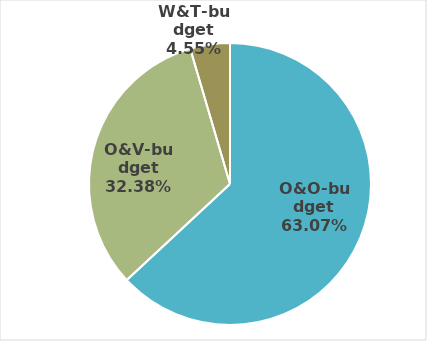
| Category | Series 1 |
|---|---|
| O&O-budget | 1398.235 |
| O&V-budget | 717.887 |
| W&T-budget | 100.84 |